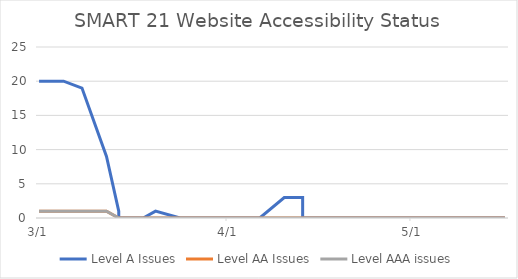
| Category | Level A Issues | Level AA Issues | Level AAA issues |
|---|---|---|---|
| 2018-03-01 08:20:57 | 20 | 1 | 1 |
| 2018-03-05 21:22:12 | 20 | 1 | 1 |
| 2018-03-08 14:25:35 | 19 | 1 | 1 |
| 2018-03-12 22:01:36 | 9 | 1 | 1 |
| 2018-03-14 14:16:35 | 1 | 0 | 0 |
| 2018-03-14 15:01:30 | 0 | 0 | 0 |
| 2018-03-18 23:14:24 | 0 | 0 | 0 |
| 2018-03-20 13:37:11 | 1 | 0 | 0 |
| 2018-03-24 21:55:36 | 0 | 0 | 0 |
| 2018-03-27 08:38:40 | 0 | 0 | 0 |
| 2018-03-31 21:50:01 | 0 | 0 | 0 |
| 2018-04-05 22:33:03 | 0 | 0 | 0 |
| 2018-04-06 11:33:34 | 0 | 0 | 0 |
| 2018-04-10 21:48:37 | 3 | 0 | 0 |
| 2018-04-13 09:17:45 | 3 | 0 | 0 |
| 2018-04-13 11:47:35 | 0 | 0 | 0 |
| 2018-04-17 23:05:08 | 0 | 0 | 0 |
| 2018-04-22 22:22:58 | 0 | 0 | 0 |
| 2018-04-27 22:04:12 | 0 | 0 | 0 |
| 2018-05-02 23:14:17 | 0 | 0 | 0 |
| 2018-05-07 22:01:45 | 0 | 0 | 0 |
| 2018-05-12 21:46:17 | 0 | 0 | 0 |
| 2018-05-16 01:10:05 | 0 | 0 | 0 |